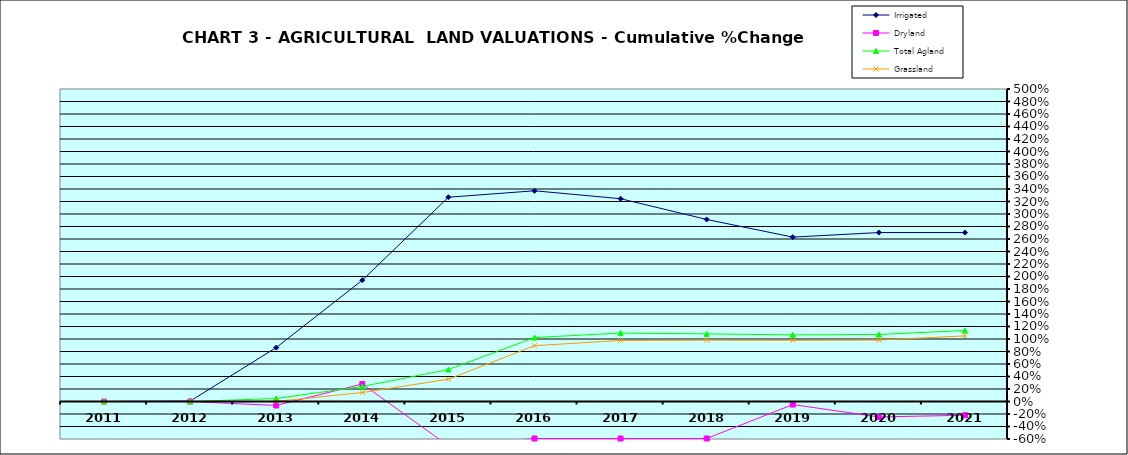
| Category | Irrigated | Dryland | Total Agland | Grassland |
|---|---|---|---|---|
| 2011.0 | 0 | 0 | 0 | 0 |
| 2012.0 | 0.006 | 0 | 0 | 0 |
| 2013.0 | 0.863 | -0.064 | 0.048 | 0.001 |
| 2014.0 | 1.941 | 0.28 | 0.241 | 0.143 |
| 2015.0 | 3.268 | -0.708 | 0.512 | 0.356 |
| 2016.0 | 3.371 | -0.592 | 1.023 | 0.893 |
| 2017.0 | 3.245 | -0.592 | 1.095 | 0.976 |
| 2018.0 | 2.913 | -0.592 | 1.082 | 0.982 |
| 2019.0 | 2.63 | -0.049 | 1.065 | 0.979 |
| 2020.0 | 2.703 | -0.247 | 1.073 | 0.983 |
| 2021.0 | 2.703 | -0.22 | 1.136 | 1.05 |